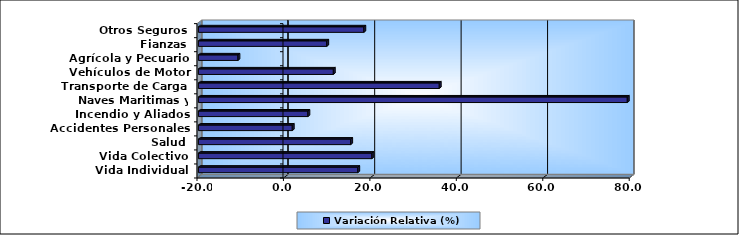
| Category | Variación Relativa (%) |
|---|---|
| Vida Individual | 16.865 |
| Vida Colectivo | 20.133 |
| Salud | 15.231 |
| Accidentes Personales | 1.71 |
| Incendio y Aliados | 5.329 |
| Naves Maritimas y Aéreas | 79.223 |
| Transporte de Carga | 35.719 |
| Vehículos de Motor | 11.21 |
| Agrícola y Pecuario | -10.855 |
| Fianzas | 9.691 |
| Otros Seguros | 18.27 |